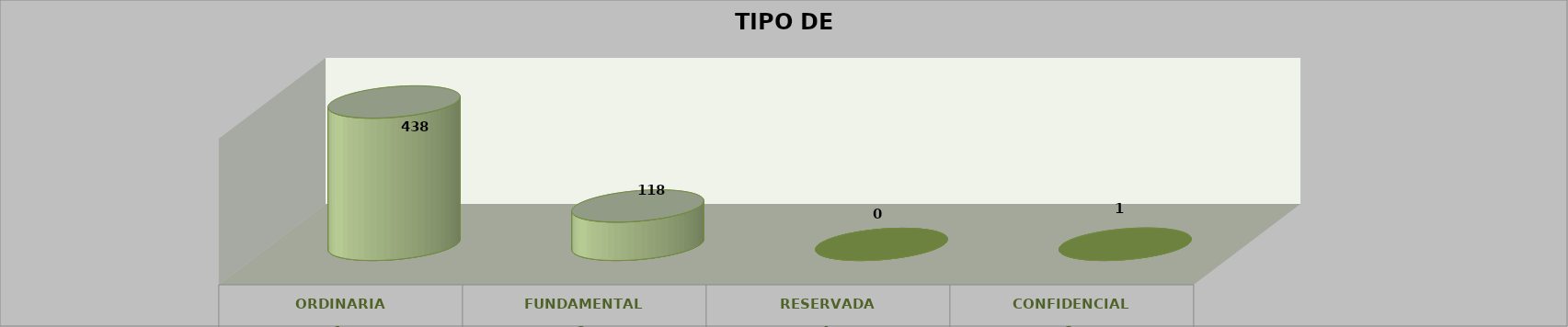
| Category | Series 0 | Series 2 | Series 1 | Series 3 | Series 4 |
|---|---|---|---|---|---|
| 0 |  |  |  | 438 | 0.786 |
| 1 |  |  |  | 118 | 0.212 |
| 2 |  |  |  | 0 | 0 |
| 3 |  |  |  | 1 | 0.002 |